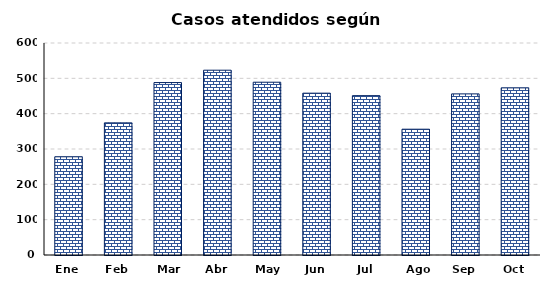
| Category | Series 0 |
|---|---|
| Ene | 278 |
| Feb | 374 |
| Mar | 488 |
| Abr | 523 |
| May | 489 |
| Jun | 458 |
| Jul | 451 |
| Ago | 356 |
| Sep | 456 |
| Oct | 473 |